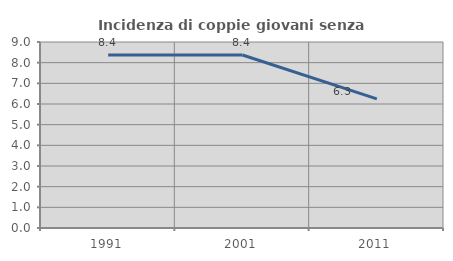
| Category | Incidenza di coppie giovani senza figli |
|---|---|
| 1991.0 | 8.369 |
| 2001.0 | 8.37 |
| 2011.0 | 6.25 |